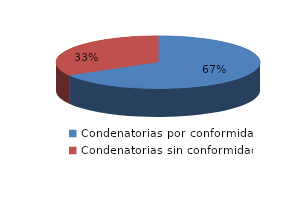
| Category | Series 0 |
|---|---|
| 0 | 2 |
| 1 | 1 |